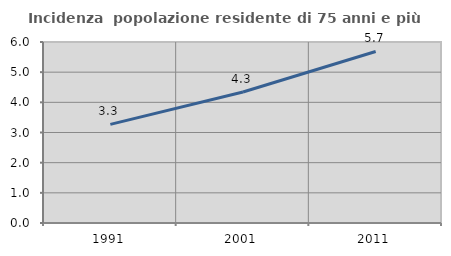
| Category | Incidenza  popolazione residente di 75 anni e più |
|---|---|
| 1991.0 | 3.268 |
| 2001.0 | 4.343 |
| 2011.0 | 5.686 |